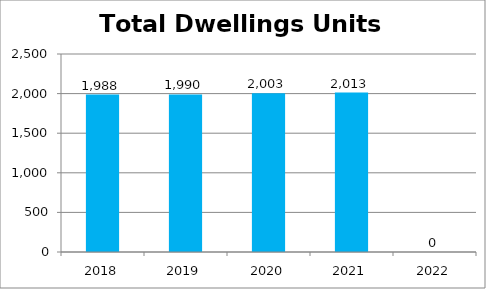
| Category | Total Dwellings Units Served |
|---|---|
| 2018.0 | 1988 |
| 2019.0 | 1990 |
| 2020.0 | 2003 |
| 2021.0 | 2013 |
| 2022.0 | 0 |